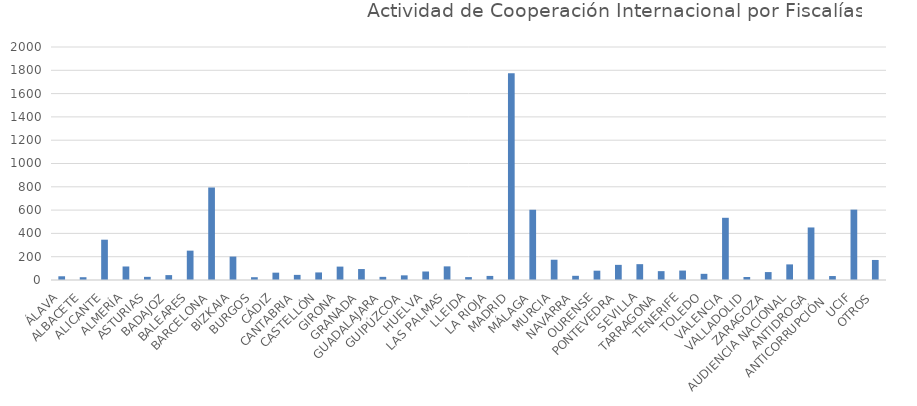
| Category | Nº DE EXPEDIENTES |
|---|---|
| ÁLAVA | 32 |
| ALBACETE | 24 |
| ALICANTE | 346 |
| ALMERÍA | 116 |
| ASTURIAS | 27 |
| BADAJOZ | 42 |
| BALEARES | 252 |
| BARCELONA | 794 |
| BIZKAIA | 201 |
| BURGOS | 24 |
| CÁDIZ | 63 |
| CANTABRIA | 44 |
| CASTELLÓN | 65 |
| GIRONA | 115 |
| GRANADA | 94 |
| GUADALAJARA | 27 |
| GUIPÚZCOA | 40 |
| HUELVA | 73 |
| LAS PALMAS | 117 |
| LLEIDA | 25 |
| LA RIOJA | 35 |
| MADRID | 1775 |
| MÁLAGA | 603 |
| MURCIA | 174 |
| NAVARRA | 36 |
| OURENSE | 80 |
| PONTEVEDRA | 130 |
| SEVILLA | 136 |
| TARRAGONA | 76 |
| TENERIFE | 81 |
| TOLEDO | 53 |
| VALENCIA | 534 |
| VALLADOLID | 26 |
| ZARAGOZA | 68 |
| AUDIENCIA NACIONAL | 134 |
| ANTIDROGA | 451 |
| ANTICORRUPCIÓN  | 34 |
| UCIF | 604 |
| OTROS | 172 |